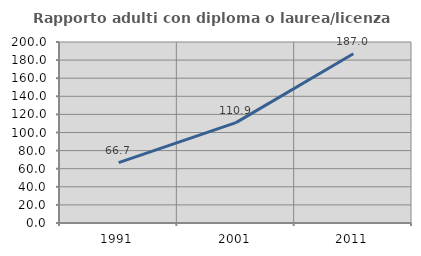
| Category | Rapporto adulti con diploma o laurea/licenza media  |
|---|---|
| 1991.0 | 66.736 |
| 2001.0 | 110.9 |
| 2011.0 | 187.048 |